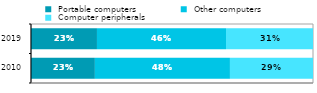
| Category |  Portable computers |  Other computers |  Computer peripherals |
|---|---|---|---|
| 2010.0 | 0.227 | 0.479 | 0.295 |
| 2019.0 | 0.234 | 0.458 | 0.308 |